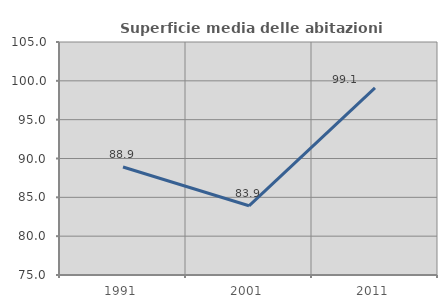
| Category | Superficie media delle abitazioni occupate |
|---|---|
| 1991.0 | 88.904 |
| 2001.0 | 83.91 |
| 2011.0 | 99.082 |